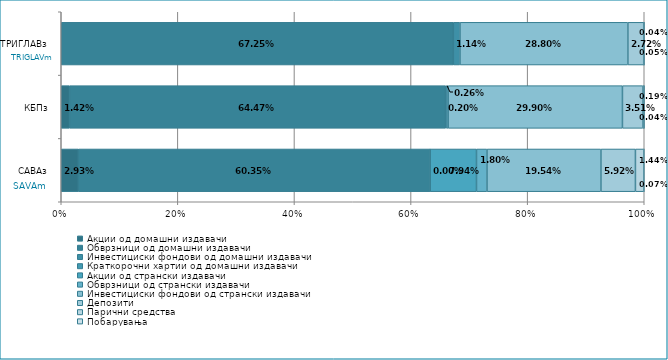
| Category | Акции од домашни издавачи  | Обврзници од домашни издавачи  | Инвестициски фондови од домашни издавачи  | Краткорочни хартии од домашни издавачи  | Акции од странски издавачи  | Обврзници од странски издавачи  | Инвестициски фондови од странски издавaчи | Депозити  | Парични средства  | Побарувања |
|---|---|---|---|---|---|---|---|---|---|---|
| САВАз | 0.029 | 0.604 | 0 | 0 | 0.079 | 0.018 | 0.195 | 0.059 | 0.014 | 0.001 |
| КБПз | 0.014 | 0.645 | 0.002 | 0 | 0 | 0.003 | 0.299 | 0.035 | 0.002 | 0 |
| ТРИГЛАВз | 0 | 0.673 | 0.011 | 0 | 0 | 0 | 0.288 | 0.027 | 0 | 0 |